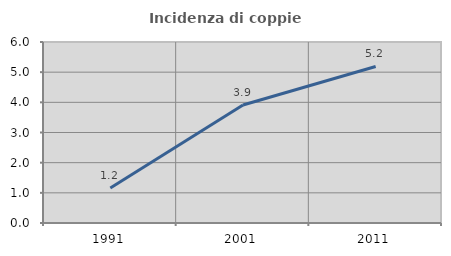
| Category | Incidenza di coppie miste |
|---|---|
| 1991.0 | 1.163 |
| 2001.0 | 3.913 |
| 2011.0 | 5.19 |